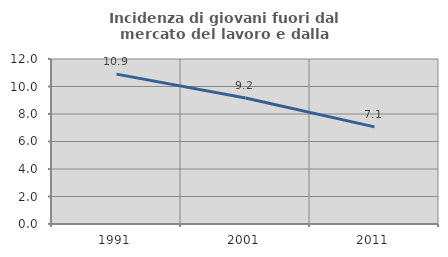
| Category | Incidenza di giovani fuori dal mercato del lavoro e dalla formazione  |
|---|---|
| 1991.0 | 10.901 |
| 2001.0 | 9.168 |
| 2011.0 | 7.062 |